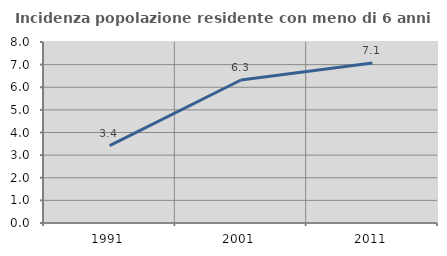
| Category | Incidenza popolazione residente con meno di 6 anni |
|---|---|
| 1991.0 | 3.417 |
| 2001.0 | 6.319 |
| 2011.0 | 7.068 |